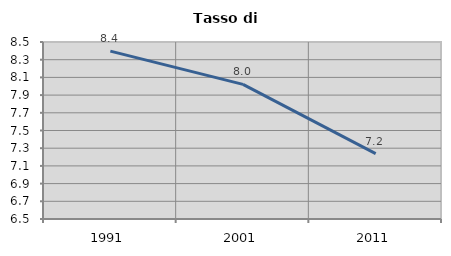
| Category | Tasso di disoccupazione   |
|---|---|
| 1991.0 | 8.397 |
| 2001.0 | 8.021 |
| 2011.0 | 7.239 |